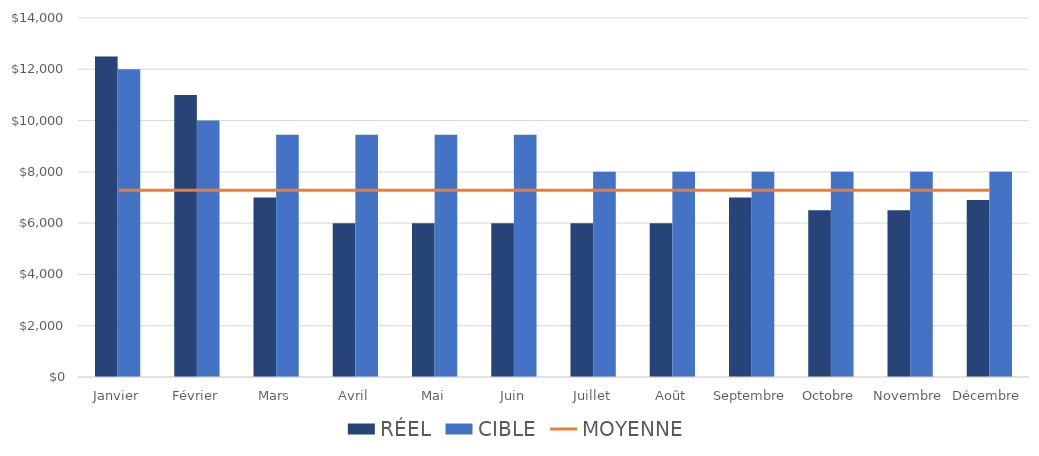
| Category | RÉEL | CIBLE |
|---|---|---|
| Janvier | 12500 | 12000 |
| Février | 11000 | 10000 |
| Mars | 7000 | 9450 |
| Avril | 6000 | 9450 |
| Mai | 6000 | 9450 |
| Juin | 6000 | 9450 |
| Juillet | 6000 | 8000 |
| Août | 6000 | 8000 |
| Septembre | 7000 | 8000 |
| Octobre | 6500 | 8000 |
| Novembre | 6500 | 8000 |
| Décembre | 6900 | 8000 |